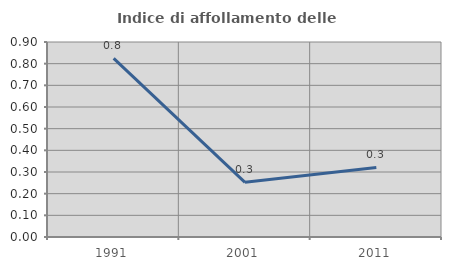
| Category | Indice di affollamento delle abitazioni  |
|---|---|
| 1991.0 | 0.824 |
| 2001.0 | 0.252 |
| 2011.0 | 0.321 |